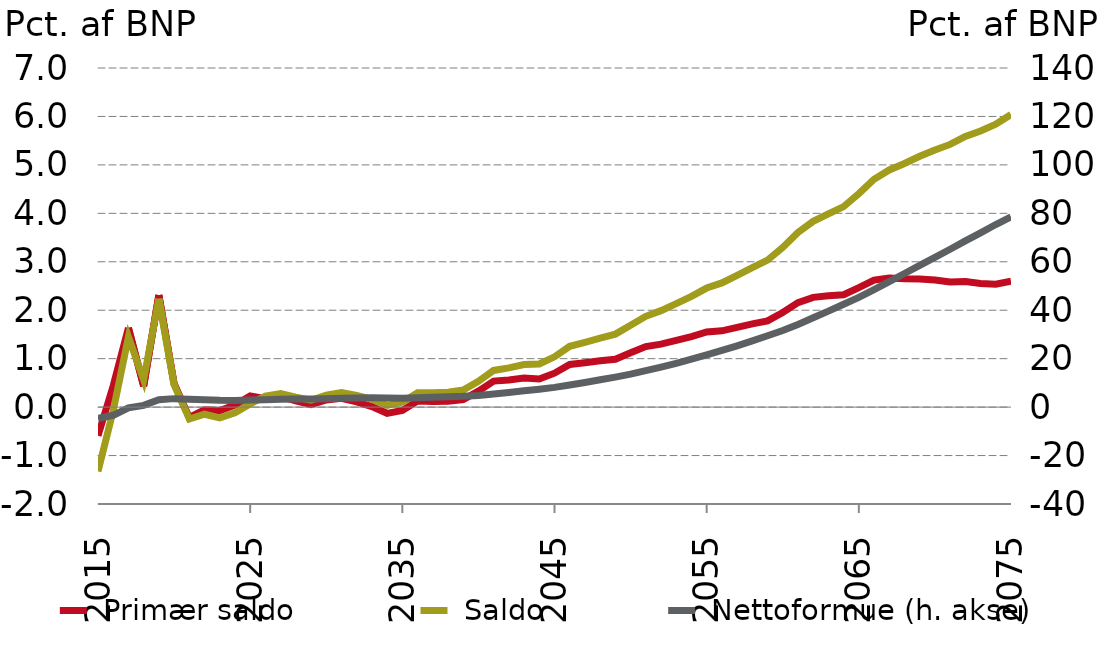
| Category | Series 4 |  Primær saldo |  Saldo |
|---|---|---|---|
| 2015-01-01 |  | -0.592 | -1.33 |
| 2016-01-01 |  | 0.442 | -0.073 |
| 2017-01-01 |  | 1.635 | 1.45 |
| 2018-01-01 |  | 0.432 | 0.559 |
| 2019-01-01 |  | 2.311 | 2.237 |
| 2020-01-01 |  | 0.487 | 0.461 |
| 2021-01-01 |  | -0.212 | -0.245 |
| 2022-01-01 |  | -0.055 | -0.147 |
| 2023-01-01 |  | -0.072 | -0.222 |
| 2024-01-01 |  | 0.044 | -0.116 |
| 2025-01-01 |  | 0.232 | 0.066 |
| 2026-01-01 |  | 0.174 | 0.225 |
| 2027-01-01 |  | 0.214 | 0.278 |
| 2028-01-01 |  | 0.128 | 0.206 |
| 2029-01-01 |  | 0.052 | 0.143 |
| 2030-01-01 |  | 0.147 | 0.248 |
| 2031-01-01 |  | 0.183 | 0.299 |
| 2032-01-01 |  | 0.108 | 0.242 |
| 2033-01-01 |  | 0.01 | 0.161 |
| 2034-01-01 |  | -0.128 | 0.036 |
| 2035-01-01 |  | -0.068 | 0.103 |
| 2036-01-01 |  | 0.124 | 0.295 |
| 2037-01-01 |  | 0.117 | 0.296 |
| 2038-01-01 |  | 0.122 | 0.308 |
| 2039-01-01 |  | 0.157 | 0.352 |
| 2040-01-01 |  | 0.329 | 0.532 |
| 2041-01-01 |  | 0.536 | 0.757 |
| 2042-01-01 |  | 0.56 | 0.809 |
| 2043-01-01 |  | 0.6 | 0.878 |
| 2044-01-01 |  | 0.581 | 0.89 |
| 2045-01-01 |  | 0.701 | 1.038 |
| 2046-01-01 |  | 0.881 | 1.256 |
| 2047-01-01 |  | 0.917 | 1.337 |
| 2048-01-01 |  | 0.958 | 1.426 |
| 2049-01-01 |  | 0.989 | 1.506 |
| 2050-01-01 |  | 1.123 | 1.69 |
| 2051-01-01 |  | 1.249 | 1.874 |
| 2052-01-01 |  | 1.3 | 1.991 |
| 2053-01-01 |  | 1.378 | 2.136 |
| 2054-01-01 |  | 1.456 | 2.286 |
| 2055-01-01 |  | 1.552 | 2.458 |
| 2056-01-01 |  | 1.576 | 2.564 |
| 2057-01-01 |  | 1.648 | 2.721 |
| 2058-01-01 |  | 1.718 | 2.879 |
| 2059-01-01 |  | 1.78 | 3.035 |
| 2060-01-01 |  | 1.953 | 3.297 |
| 2061-01-01 |  | 2.156 | 3.607 |
| 2062-01-01 |  | 2.266 | 3.835 |
| 2063-01-01 |  | 2.297 | 3.99 |
| 2064-01-01 |  | 2.319 | 4.139 |
| 2065-01-01 |  | 2.465 | 4.407 |
| 2066-01-01 |  | 2.623 | 4.704 |
| 2067-01-01 |  | 2.666 | 4.895 |
| 2068-01-01 |  | 2.648 | 5.028 |
| 2069-01-01 |  | 2.643 | 5.177 |
| 2070-01-01 |  | 2.625 | 5.308 |
| 2071-01-01 |  | 2.584 | 5.423 |
| 2072-01-01 |  | 2.595 | 5.588 |
| 2073-01-01 |  | 2.553 | 5.701 |
| 2074-01-01 |  | 2.535 | 5.838 |
| 2075-01-01 |  | 2.597 | 6.041 |